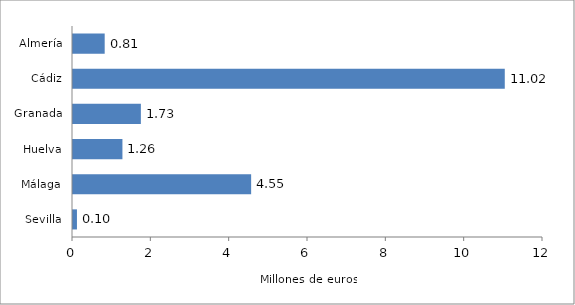
| Category | Series 0 |
|---|---|
| Almería | 0.809 |
| Cádiz | 11.024 |
| Granada | 1.733 |
| Huelva | 1.262 |
| Málaga | 4.548 |
| Sevilla | 0.101 |